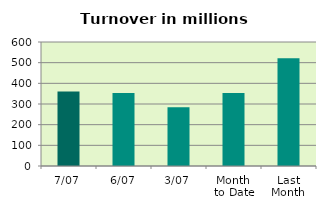
| Category | Series 0 |
|---|---|
| 7/07 | 360.427 |
| 6/07 | 352.922 |
| 3/07 | 284.129 |
| Month 
to Date | 353.282 |
| Last
Month | 521.023 |